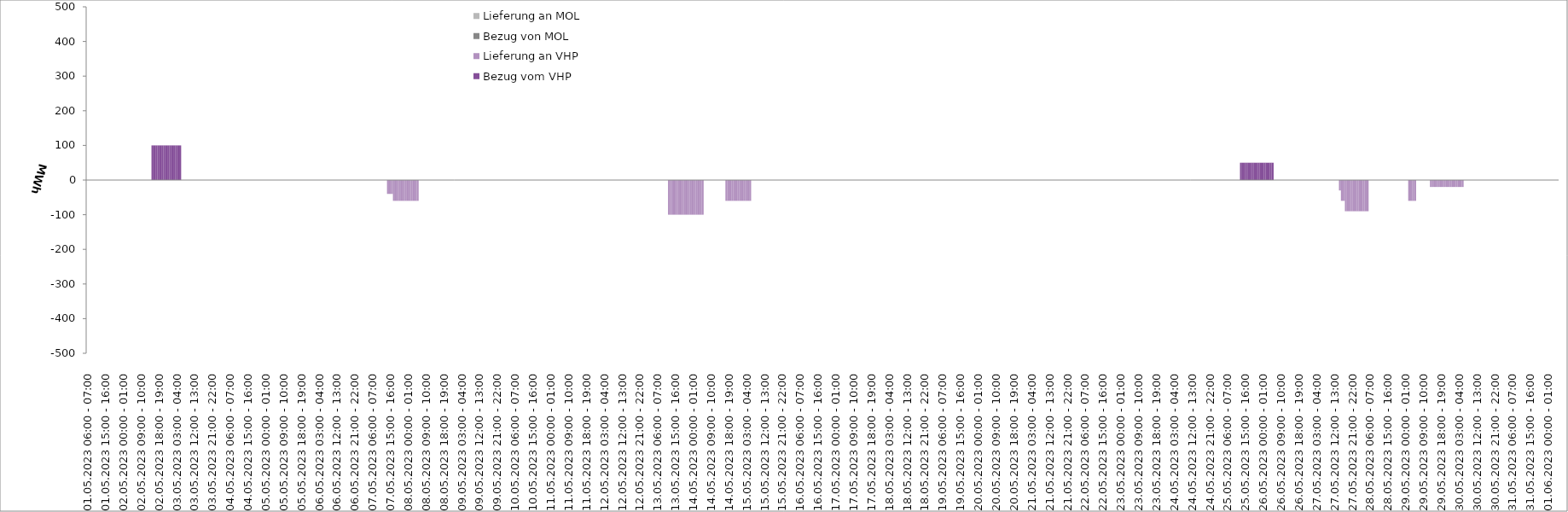
| Category | Bezug vom VHP | Lieferung an VHP | Bezug von MOL | Lieferung an MOL |
|---|---|---|---|---|
| 01.05.2023 06:00 - 07:00 | 0 | 0 | 0 | 0 |
| 01.05.2023 07:00 - 08:00 | 0 | 0 | 0 | 0 |
| 01.05.2023 08:00 - 09:00 | 0 | 0 | 0 | 0 |
| 01.05.2023 09:00 - 10:00 | 0 | 0 | 0 | 0 |
| 01.05.2023 10:00 - 11:00 | 0 | 0 | 0 | 0 |
| 01.05.2023 11:00 - 12:00 | 0 | 0 | 0 | 0 |
| 01.05.2023 12:00 - 13:00 | 0 | 0 | 0 | 0 |
| 01.05.2023 13:00 - 14:00 | 0 | 0 | 0 | 0 |
| 01.05.2023 14:00 - 15:00 | 0 | 0 | 0 | 0 |
| 01.05.2023 15:00 - 16:00 | 0 | 0 | 0 | 0 |
| 01.05.2023 16:00 - 17:00 | 0 | 0 | 0 | 0 |
| 01.05.2023 17:00 - 18:00 | 0 | 0 | 0 | 0 |
| 01.05.2023 18:00 - 19:00 | 0 | 0 | 0 | 0 |
| 01.05.2023 19:00 - 20:00 | 0 | 0 | 0 | 0 |
| 01.05.2023 20:00 - 21:00 | 0 | 0 | 0 | 0 |
| 01.05.2023 21:00 - 22:00 | 0 | 0 | 0 | 0 |
| 01.05.2023 22:00 - 23:00 | 0 | 0 | 0 | 0 |
| 01.05.2023 23:00 - 24:00 | 0 | 0 | 0 | 0 |
| 02.05.2023 00:00 - 01:00 | 0 | 0 | 0 | 0 |
| 02.05.2023 01:00 - 02:00 | 0 | 0 | 0 | 0 |
| 02.05.2023 02:00 - 03:00 | 0 | 0 | 0 | 0 |
| 02.05.2023 03:00 - 04:00 | 0 | 0 | 0 | 0 |
| 02.05.2023 04:00 - 05:00 | 0 | 0 | 0 | 0 |
| 02.05.2023 05:00 - 06:00 | 0 | 0 | 0 | 0 |
| 02.05.2023 06:00 - 07:00 | 0 | 0 | 0 | 0 |
| 02.05.2023 07:00 - 08:00 | 0 | 0 | 0 | 0 |
| 02.05.2023 08:00 - 09:00 | 0 | 0 | 0 | 0 |
| 02.05.2023 09:00 - 10:00 | 0 | 0 | 0 | 0 |
| 02.05.2023 10:00 - 11:00 | 0 | 0 | 0 | 0 |
| 02.05.2023 11:00 - 12:00 | 0 | 0 | 0 | 0 |
| 02.05.2023 12:00 - 13:00 | 0 | 0 | 0 | 0 |
| 02.05.2023 13:00 - 14:00 | 0 | 0 | 0 | 0 |
| 02.05.2023 14:00 - 15:00 | 0 | 0 | 0 | 0 |
| 02.05.2023 15:00 - 16:00 | 100 | 0 | 0 | 0 |
| 02.05.2023 16:00 - 17:00 | 100 | 0 | 0 | 0 |
| 02.05.2023 17:00 - 18:00 | 100 | 0 | 0 | 0 |
| 02.05.2023 18:00 - 19:00 | 100 | 0 | 0 | 0 |
| 02.05.2023 19:00 - 20:00 | 100 | 0 | 0 | 0 |
| 02.05.2023 20:00 - 21:00 | 100 | 0 | 0 | 0 |
| 02.05.2023 21:00 - 22:00 | 100 | 0 | 0 | 0 |
| 02.05.2023 22:00 - 23:00 | 100 | 0 | 0 | 0 |
| 02.05.2023 23:00 - 24:00 | 100 | 0 | 0 | 0 |
| 03.05.2023 00:00 - 01:00 | 100 | 0 | 0 | 0 |
| 03.05.2023 01:00 - 02:00 | 100 | 0 | 0 | 0 |
| 03.05.2023 02:00 - 03:00 | 100 | 0 | 0 | 0 |
| 03.05.2023 03:00 - 04:00 | 100 | 0 | 0 | 0 |
| 03.05.2023 04:00 - 05:00 | 100 | 0 | 0 | 0 |
| 03.05.2023 05:00 - 06:00 | 100 | 0 | 0 | 0 |
| 03.05.2023 06:00 - 07:00 | 0 | 0 | 0 | 0 |
| 03.05.2023 07:00 - 08:00 | 0 | 0 | 0 | 0 |
| 03.05.2023 08:00 - 09:00 | 0 | 0 | 0 | 0 |
| 03.05.2023 09:00 - 10:00 | 0 | 0 | 0 | 0 |
| 03.05.2023 10:00 - 11:00 | 0 | 0 | 0 | 0 |
| 03.05.2023 11:00 - 12:00 | 0 | 0 | 0 | 0 |
| 03.05.2023 12:00 - 13:00 | 0 | 0 | 0 | 0 |
| 03.05.2023 13:00 - 14:00 | 0 | 0 | 0 | 0 |
| 03.05.2023 14:00 - 15:00 | 0 | 0 | 0 | 0 |
| 03.05.2023 15:00 - 16:00 | 0 | 0 | 0 | 0 |
| 03.05.2023 16:00 - 17:00 | 0 | 0 | 0 | 0 |
| 03.05.2023 17:00 - 18:00 | 0 | 0 | 0 | 0 |
| 03.05.2023 18:00 - 19:00 | 0 | 0 | 0 | 0 |
| 03.05.2023 19:00 - 20:00 | 0 | 0 | 0 | 0 |
| 03.05.2023 20:00 - 21:00 | 0 | 0 | 0 | 0 |
| 03.05.2023 21:00 - 22:00 | 0 | 0 | 0 | 0 |
| 03.05.2023 22:00 - 23:00 | 0 | 0 | 0 | 0 |
| 03.05.2023 23:00 - 24:00 | 0 | 0 | 0 | 0 |
| 04.05.2023 00:00 - 01:00 | 0 | 0 | 0 | 0 |
| 04.05.2023 01:00 - 02:00 | 0 | 0 | 0 | 0 |
| 04.05.2023 02:00 - 03:00 | 0 | 0 | 0 | 0 |
| 04.05.2023 03:00 - 04:00 | 0 | 0 | 0 | 0 |
| 04.05.2023 04:00 - 05:00 | 0 | 0 | 0 | 0 |
| 04.05.2023 05:00 - 06:00 | 0 | 0 | 0 | 0 |
| 04.05.2023 06:00 - 07:00 | 0 | 0 | 0 | 0 |
| 04.05.2023 07:00 - 08:00 | 0 | 0 | 0 | 0 |
| 04.05.2023 08:00 - 09:00 | 0 | 0 | 0 | 0 |
| 04.05.2023 09:00 - 10:00 | 0 | 0 | 0 | 0 |
| 04.05.2023 10:00 - 11:00 | 0 | 0 | 0 | 0 |
| 04.05.2023 11:00 - 12:00 | 0 | 0 | 0 | 0 |
| 04.05.2023 12:00 - 13:00 | 0 | 0 | 0 | 0 |
| 04.05.2023 13:00 - 14:00 | 0 | 0 | 0 | 0 |
| 04.05.2023 14:00 - 15:00 | 0 | 0 | 0 | 0 |
| 04.05.2023 15:00 - 16:00 | 0 | 0 | 0 | 0 |
| 04.05.2023 16:00 - 17:00 | 0 | 0 | 0 | 0 |
| 04.05.2023 17:00 - 18:00 | 0 | 0 | 0 | 0 |
| 04.05.2023 18:00 - 19:00 | 0 | 0 | 0 | 0 |
| 04.05.2023 19:00 - 20:00 | 0 | 0 | 0 | 0 |
| 04.05.2023 20:00 - 21:00 | 0 | 0 | 0 | 0 |
| 04.05.2023 21:00 - 22:00 | 0 | 0 | 0 | 0 |
| 04.05.2023 22:00 - 23:00 | 0 | 0 | 0 | 0 |
| 04.05.2023 23:00 - 24:00 | 0 | 0 | 0 | 0 |
| 05.05.2023 00:00 - 01:00 | 0 | 0 | 0 | 0 |
| 05.05.2023 01:00 - 02:00 | 0 | 0 | 0 | 0 |
| 05.05.2023 02:00 - 03:00 | 0 | 0 | 0 | 0 |
| 05.05.2023 03:00 - 04:00 | 0 | 0 | 0 | 0 |
| 05.05.2023 04:00 - 05:00 | 0 | 0 | 0 | 0 |
| 05.05.2023 05:00 - 06:00 | 0 | 0 | 0 | 0 |
| 05.05.2023 06:00 - 07:00 | 0 | 0 | 0 | 0 |
| 05.05.2023 07:00 - 08:00 | 0 | 0 | 0 | 0 |
| 05.05.2023 08:00 - 09:00 | 0 | 0 | 0 | 0 |
| 05.05.2023 09:00 - 10:00 | 0 | 0 | 0 | 0 |
| 05.05.2023 10:00 - 11:00 | 0 | 0 | 0 | 0 |
| 05.05.2023 11:00 - 12:00 | 0 | 0 | 0 | 0 |
| 05.05.2023 12:00 - 13:00 | 0 | 0 | 0 | 0 |
| 05.05.2023 13:00 - 14:00 | 0 | 0 | 0 | 0 |
| 05.05.2023 14:00 - 15:00 | 0 | 0 | 0 | 0 |
| 05.05.2023 15:00 - 16:00 | 0 | 0 | 0 | 0 |
| 05.05.2023 16:00 - 17:00 | 0 | 0 | 0 | 0 |
| 05.05.2023 17:00 - 18:00 | 0 | 0 | 0 | 0 |
| 05.05.2023 18:00 - 19:00 | 0 | 0 | 0 | 0 |
| 05.05.2023 19:00 - 20:00 | 0 | 0 | 0 | 0 |
| 05.05.2023 20:00 - 21:00 | 0 | 0 | 0 | 0 |
| 05.05.2023 21:00 - 22:00 | 0 | 0 | 0 | 0 |
| 05.05.2023 22:00 - 23:00 | 0 | 0 | 0 | 0 |
| 05.05.2023 23:00 - 24:00 | 0 | 0 | 0 | 0 |
| 06.05.2023 00:00 - 01:00 | 0 | 0 | 0 | 0 |
| 06.05.2023 01:00 - 02:00 | 0 | 0 | 0 | 0 |
| 06.05.2023 02:00 - 03:00 | 0 | 0 | 0 | 0 |
| 06.05.2023 03:00 - 04:00 | 0 | 0 | 0 | 0 |
| 06.05.2023 04:00 - 05:00 | 0 | 0 | 0 | 0 |
| 06.05.2023 05:00 - 06:00 | 0 | 0 | 0 | 0 |
| 06.05.2023 06:00 - 07:00 | 0 | 0 | 0 | 0 |
| 06.05.2023 07:00 - 08:00 | 0 | 0 | 0 | 0 |
| 06.05.2023 08:00 - 09:00 | 0 | 0 | 0 | 0 |
| 06.05.2023 09:00 - 10:00 | 0 | 0 | 0 | 0 |
| 06.05.2023 10:00 - 11:00 | 0 | 0 | 0 | 0 |
| 06.05.2023 11:00 - 12:00 | 0 | 0 | 0 | 0 |
| 06.05.2023 12:00 - 13:00 | 0 | 0 | 0 | 0 |
| 06.05.2023 13:00 - 14:00 | 0 | 0 | 0 | 0 |
| 06.05.2023 14:00 - 15:00 | 0 | 0 | 0 | 0 |
| 06.05.2023 15:00 - 16:00 | 0 | 0 | 0 | 0 |
| 06.05.2023 16:00 - 17:00 | 0 | 0 | 0 | 0 |
| 06.05.2023 17:00 - 18:00 | 0 | 0 | 0 | 0 |
| 06.05.2023 18:00 - 19:00 | 0 | 0 | 0 | 0 |
| 06.05.2023 19:00 - 20:00 | 0 | 0 | 0 | 0 |
| 06.05.2023 20:00 - 21:00 | 0 | 0 | 0 | 0 |
| 06.05.2023 21:00 - 22:00 | 0 | 0 | 0 | 0 |
| 06.05.2023 22:00 - 23:00 | 0 | 0 | 0 | 0 |
| 06.05.2023 23:00 - 24:00 | 0 | 0 | 0 | 0 |
| 07.05.2023 00:00 - 01:00 | 0 | 0 | 0 | 0 |
| 07.05.2023 01:00 - 02:00 | 0 | 0 | 0 | 0 |
| 07.05.2023 02:00 - 03:00 | 0 | 0 | 0 | 0 |
| 07.05.2023 03:00 - 04:00 | 0 | 0 | 0 | 0 |
| 07.05.2023 04:00 - 05:00 | 0 | 0 | 0 | 0 |
| 07.05.2023 05:00 - 06:00 | 0 | 0 | 0 | 0 |
| 07.05.2023 06:00 - 07:00 | 0 | 0 | 0 | 0 |
| 07.05.2023 07:00 - 08:00 | 0 | 0 | 0 | 0 |
| 07.05.2023 08:00 - 09:00 | 0 | 0 | 0 | 0 |
| 07.05.2023 09:00 - 10:00 | 0 | 0 | 0 | 0 |
| 07.05.2023 10:00 - 11:00 | 0 | 0 | 0 | 0 |
| 07.05.2023 11:00 - 12:00 | 0 | 0 | 0 | 0 |
| 07.05.2023 12:00 - 13:00 | 0 | 0 | 0 | 0 |
| 07.05.2023 13:00 - 14:00 | 0 | 0 | 0 | 0 |
| 07.05.2023 14:00 - 15:00 | 0 | -40 | 0 | 0 |
| 07.05.2023 15:00 - 16:00 | 0 | -40 | 0 | 0 |
| 07.05.2023 16:00 - 17:00 | 0 | -40 | 0 | 0 |
| 07.05.2023 17:00 - 18:00 | 0 | -60 | 0 | 0 |
| 07.05.2023 18:00 - 19:00 | 0 | -60 | 0 | 0 |
| 07.05.2023 19:00 - 20:00 | 0 | -60 | 0 | 0 |
| 07.05.2023 20:00 - 21:00 | 0 | -60 | 0 | 0 |
| 07.05.2023 21:00 - 22:00 | 0 | -60 | 0 | 0 |
| 07.05.2023 22:00 - 23:00 | 0 | -60 | 0 | 0 |
| 07.05.2023 23:00 - 24:00 | 0 | -60 | 0 | 0 |
| 08.05.2023 00:00 - 01:00 | 0 | -60 | 0 | 0 |
| 08.05.2023 01:00 - 02:00 | 0 | -60 | 0 | 0 |
| 08.05.2023 02:00 - 03:00 | 0 | -60 | 0 | 0 |
| 08.05.2023 03:00 - 04:00 | 0 | -60 | 0 | 0 |
| 08.05.2023 04:00 - 05:00 | 0 | -60 | 0 | 0 |
| 08.05.2023 05:00 - 06:00 | 0 | -60 | 0 | 0 |
| 08.05.2023 06:00 - 07:00 | 0 | 0 | 0 | 0 |
| 08.05.2023 07:00 - 08:00 | 0 | 0 | 0 | 0 |
| 08.05.2023 08:00 - 09:00 | 0 | 0 | 0 | 0 |
| 08.05.2023 09:00 - 10:00 | 0 | 0 | 0 | 0 |
| 08.05.2023 10:00 - 11:00 | 0 | 0 | 0 | 0 |
| 08.05.2023 11:00 - 12:00 | 0 | 0 | 0 | 0 |
| 08.05.2023 12:00 - 13:00 | 0 | 0 | 0 | 0 |
| 08.05.2023 13:00 - 14:00 | 0 | 0 | 0 | 0 |
| 08.05.2023 14:00 - 15:00 | 0 | 0 | 0 | 0 |
| 08.05.2023 15:00 - 16:00 | 0 | 0 | 0 | 0 |
| 08.05.2023 16:00 - 17:00 | 0 | 0 | 0 | 0 |
| 08.05.2023 17:00 - 18:00 | 0 | 0 | 0 | 0 |
| 08.05.2023 18:00 - 19:00 | 0 | 0 | 0 | 0 |
| 08.05.2023 19:00 - 20:00 | 0 | 0 | 0 | 0 |
| 08.05.2023 20:00 - 21:00 | 0 | 0 | 0 | 0 |
| 08.05.2023 21:00 - 22:00 | 0 | 0 | 0 | 0 |
| 08.05.2023 22:00 - 23:00 | 0 | 0 | 0 | 0 |
| 08.05.2023 23:00 - 24:00 | 0 | 0 | 0 | 0 |
| 09.05.2023 00:00 - 01:00 | 0 | 0 | 0 | 0 |
| 09.05.2023 01:00 - 02:00 | 0 | 0 | 0 | 0 |
| 09.05.2023 02:00 - 03:00 | 0 | 0 | 0 | 0 |
| 09.05.2023 03:00 - 04:00 | 0 | 0 | 0 | 0 |
| 09.05.2023 04:00 - 05:00 | 0 | 0 | 0 | 0 |
| 09.05.2023 05:00 - 06:00 | 0 | 0 | 0 | 0 |
| 09.05.2023 06:00 - 07:00 | 0 | 0 | 0 | 0 |
| 09.05.2023 07:00 - 08:00 | 0 | 0 | 0 | 0 |
| 09.05.2023 08:00 - 09:00 | 0 | 0 | 0 | 0 |
| 09.05.2023 09:00 - 10:00 | 0 | 0 | 0 | 0 |
| 09.05.2023 10:00 - 11:00 | 0 | 0 | 0 | 0 |
| 09.05.2023 11:00 - 12:00 | 0 | 0 | 0 | 0 |
| 09.05.2023 12:00 - 13:00 | 0 | 0 | 0 | 0 |
| 09.05.2023 13:00 - 14:00 | 0 | 0 | 0 | 0 |
| 09.05.2023 14:00 - 15:00 | 0 | 0 | 0 | 0 |
| 09.05.2023 15:00 - 16:00 | 0 | 0 | 0 | 0 |
| 09.05.2023 16:00 - 17:00 | 0 | 0 | 0 | 0 |
| 09.05.2023 17:00 - 18:00 | 0 | 0 | 0 | 0 |
| 09.05.2023 18:00 - 19:00 | 0 | 0 | 0 | 0 |
| 09.05.2023 19:00 - 20:00 | 0 | 0 | 0 | 0 |
| 09.05.2023 20:00 - 21:00 | 0 | 0 | 0 | 0 |
| 09.05.2023 21:00 - 22:00 | 0 | 0 | 0 | 0 |
| 09.05.2023 22:00 - 23:00 | 0 | 0 | 0 | 0 |
| 09.05.2023 23:00 - 24:00 | 0 | 0 | 0 | 0 |
| 10.05.2023 00:00 - 01:00 | 0 | 0 | 0 | 0 |
| 10.05.2023 01:00 - 02:00 | 0 | 0 | 0 | 0 |
| 10.05.2023 02:00 - 03:00 | 0 | 0 | 0 | 0 |
| 10.05.2023 03:00 - 04:00 | 0 | 0 | 0 | 0 |
| 10.05.2023 04:00 - 05:00 | 0 | 0 | 0 | 0 |
| 10.05.2023 05:00 - 06:00 | 0 | 0 | 0 | 0 |
| 10.05.2023 06:00 - 07:00 | 0 | 0 | 0 | 0 |
| 10.05.2023 07:00 - 08:00 | 0 | 0 | 0 | 0 |
| 10.05.2023 08:00 - 09:00 | 0 | 0 | 0 | 0 |
| 10.05.2023 09:00 - 10:00 | 0 | 0 | 0 | 0 |
| 10.05.2023 10:00 - 11:00 | 0 | 0 | 0 | 0 |
| 10.05.2023 11:00 - 12:00 | 0 | 0 | 0 | 0 |
| 10.05.2023 12:00 - 13:00 | 0 | 0 | 0 | 0 |
| 10.05.2023 13:00 - 14:00 | 0 | 0 | 0 | 0 |
| 10.05.2023 14:00 - 15:00 | 0 | 0 | 0 | 0 |
| 10.05.2023 15:00 - 16:00 | 0 | 0 | 0 | 0 |
| 10.05.2023 16:00 - 17:00 | 0 | 0 | 0 | 0 |
| 10.05.2023 17:00 - 18:00 | 0 | 0 | 0 | 0 |
| 10.05.2023 18:00 - 19:00 | 0 | 0 | 0 | 0 |
| 10.05.2023 19:00 - 20:00 | 0 | 0 | 0 | 0 |
| 10.05.2023 20:00 - 21:00 | 0 | 0 | 0 | 0 |
| 10.05.2023 21:00 - 22:00 | 0 | 0 | 0 | 0 |
| 10.05.2023 22:00 - 23:00 | 0 | 0 | 0 | 0 |
| 10.05.2023 23:00 - 24:00 | 0 | 0 | 0 | 0 |
| 11.05.2023 00:00 - 01:00 | 0 | 0 | 0 | 0 |
| 11.05.2023 01:00 - 02:00 | 0 | 0 | 0 | 0 |
| 11.05.2023 02:00 - 03:00 | 0 | 0 | 0 | 0 |
| 11.05.2023 03:00 - 04:00 | 0 | 0 | 0 | 0 |
| 11.05.2023 04:00 - 05:00 | 0 | 0 | 0 | 0 |
| 11.05.2023 05:00 - 06:00 | 0 | 0 | 0 | 0 |
| 11.05.2023 06:00 - 07:00 | 0 | 0 | 0 | 0 |
| 11.05.2023 07:00 - 08:00 | 0 | 0 | 0 | 0 |
| 11.05.2023 08:00 - 09:00 | 0 | 0 | 0 | 0 |
| 11.05.2023 09:00 - 10:00 | 0 | 0 | 0 | 0 |
| 11.05.2023 10:00 - 11:00 | 0 | 0 | 0 | 0 |
| 11.05.2023 11:00 - 12:00 | 0 | 0 | 0 | 0 |
| 11.05.2023 12:00 - 13:00 | 0 | 0 | 0 | 0 |
| 11.05.2023 13:00 - 14:00 | 0 | 0 | 0 | 0 |
| 11.05.2023 14:00 - 15:00 | 0 | 0 | 0 | 0 |
| 11.05.2023 15:00 - 16:00 | 0 | 0 | 0 | 0 |
| 11.05.2023 16:00 - 17:00 | 0 | 0 | 0 | 0 |
| 11.05.2023 17:00 - 18:00 | 0 | 0 | 0 | 0 |
| 11.05.2023 18:00 - 19:00 | 0 | 0 | 0 | 0 |
| 11.05.2023 19:00 - 20:00 | 0 | 0 | 0 | 0 |
| 11.05.2023 20:00 - 21:00 | 0 | 0 | 0 | 0 |
| 11.05.2023 21:00 - 22:00 | 0 | 0 | 0 | 0 |
| 11.05.2023 22:00 - 23:00 | 0 | 0 | 0 | 0 |
| 11.05.2023 23:00 - 24:00 | 0 | 0 | 0 | 0 |
| 12.05.2023 00:00 - 01:00 | 0 | 0 | 0 | 0 |
| 12.05.2023 01:00 - 02:00 | 0 | 0 | 0 | 0 |
| 12.05.2023 02:00 - 03:00 | 0 | 0 | 0 | 0 |
| 12.05.2023 03:00 - 04:00 | 0 | 0 | 0 | 0 |
| 12.05.2023 04:00 - 05:00 | 0 | 0 | 0 | 0 |
| 12.05.2023 05:00 - 06:00 | 0 | 0 | 0 | 0 |
| 12.05.2023 06:00 - 07:00 | 0 | 0 | 0 | 0 |
| 12.05.2023 07:00 - 08:00 | 0 | 0 | 0 | 0 |
| 12.05.2023 08:00 - 09:00 | 0 | 0 | 0 | 0 |
| 12.05.2023 09:00 - 10:00 | 0 | 0 | 0 | 0 |
| 12.05.2023 10:00 - 11:00 | 0 | 0 | 0 | 0 |
| 12.05.2023 11:00 - 12:00 | 0 | 0 | 0 | 0 |
| 12.05.2023 12:00 - 13:00 | 0 | 0 | 0 | 0 |
| 12.05.2023 13:00 - 14:00 | 0 | 0 | 0 | 0 |
| 12.05.2023 14:00 - 15:00 | 0 | 0 | 0 | 0 |
| 12.05.2023 15:00 - 16:00 | 0 | 0 | 0 | 0 |
| 12.05.2023 16:00 - 17:00 | 0 | 0 | 0 | 0 |
| 12.05.2023 17:00 - 18:00 | 0 | 0 | 0 | 0 |
| 12.05.2023 18:00 - 19:00 | 0 | 0 | 0 | 0 |
| 12.05.2023 19:00 - 20:00 | 0 | 0 | 0 | 0 |
| 12.05.2023 20:00 - 21:00 | 0 | 0 | 0 | 0 |
| 12.05.2023 21:00 - 22:00 | 0 | 0 | 0 | 0 |
| 12.05.2023 22:00 - 23:00 | 0 | 0 | 0 | 0 |
| 12.05.2023 23:00 - 24:00 | 0 | 0 | 0 | 0 |
| 13.05.2023 00:00 - 01:00 | 0 | 0 | 0 | 0 |
| 13.05.2023 01:00 - 02:00 | 0 | 0 | 0 | 0 |
| 13.05.2023 02:00 - 03:00 | 0 | 0 | 0 | 0 |
| 13.05.2023 03:00 - 04:00 | 0 | 0 | 0 | 0 |
| 13.05.2023 04:00 - 05:00 | 0 | 0 | 0 | 0 |
| 13.05.2023 05:00 - 06:00 | 0 | 0 | 0 | 0 |
| 13.05.2023 06:00 - 07:00 | 0 | 0 | 0 | 0 |
| 13.05.2023 07:00 - 08:00 | 0 | 0 | 0 | 0 |
| 13.05.2023 08:00 - 09:00 | 0 | 0 | 0 | 0 |
| 13.05.2023 09:00 - 10:00 | 0 | 0 | 0 | 0 |
| 13.05.2023 10:00 - 11:00 | 0 | 0 | 0 | 0 |
| 13.05.2023 11:00 - 12:00 | 0 | 0 | 0 | 0 |
| 13.05.2023 12:00 - 13:00 | 0 | -100 | 0 | 0 |
| 13.05.2023 13:00 - 14:00 | 0 | -100 | 0 | 0 |
| 13.05.2023 14:00 - 15:00 | 0 | -100 | 0 | 0 |
| 13.05.2023 15:00 - 16:00 | 0 | -100 | 0 | 0 |
| 13.05.2023 16:00 - 17:00 | 0 | -100 | 0 | 0 |
| 13.05.2023 17:00 - 18:00 | 0 | -100 | 0 | 0 |
| 13.05.2023 18:00 - 19:00 | 0 | -100 | 0 | 0 |
| 13.05.2023 19:00 - 20:00 | 0 | -100 | 0 | 0 |
| 13.05.2023 20:00 - 21:00 | 0 | -100 | 0 | 0 |
| 13.05.2023 21:00 - 22:00 | 0 | -100 | 0 | 0 |
| 13.05.2023 22:00 - 23:00 | 0 | -100 | 0 | 0 |
| 13.05.2023 23:00 - 24:00 | 0 | -100 | 0 | 0 |
| 14.05.2023 00:00 - 01:00 | 0 | -100 | 0 | 0 |
| 14.05.2023 01:00 - 02:00 | 0 | -100 | 0 | 0 |
| 14.05.2023 02:00 - 03:00 | 0 | -100 | 0 | 0 |
| 14.05.2023 03:00 - 04:00 | 0 | -100 | 0 | 0 |
| 14.05.2023 04:00 - 05:00 | 0 | -100 | 0 | 0 |
| 14.05.2023 05:00 - 06:00 | 0 | -100 | 0 | 0 |
| 14.05.2023 06:00 - 07:00 | 0 | 0 | 0 | 0 |
| 14.05.2023 07:00 - 08:00 | 0 | 0 | 0 | 0 |
| 14.05.2023 08:00 - 09:00 | 0 | 0 | 0 | 0 |
| 14.05.2023 09:00 - 10:00 | 0 | 0 | 0 | 0 |
| 14.05.2023 10:00 - 11:00 | 0 | 0 | 0 | 0 |
| 14.05.2023 11:00 - 12:00 | 0 | 0 | 0 | 0 |
| 14.05.2023 12:00 - 13:00 | 0 | 0 | 0 | 0 |
| 14.05.2023 13:00 - 14:00 | 0 | 0 | 0 | 0 |
| 14.05.2023 14:00 - 15:00 | 0 | 0 | 0 | 0 |
| 14.05.2023 15:00 - 16:00 | 0 | 0 | 0 | 0 |
| 14.05.2023 16:00 - 17:00 | 0 | 0 | 0 | 0 |
| 14.05.2023 17:00 - 18:00 | 0 | -60 | 0 | 0 |
| 14.05.2023 18:00 - 19:00 | 0 | -60 | 0 | 0 |
| 14.05.2023 19:00 - 20:00 | 0 | -60 | 0 | 0 |
| 14.05.2023 20:00 - 21:00 | 0 | -60 | 0 | 0 |
| 14.05.2023 21:00 - 22:00 | 0 | -60 | 0 | 0 |
| 14.05.2023 22:00 - 23:00 | 0 | -60 | 0 | 0 |
| 14.05.2023 23:00 - 24:00 | 0 | -60 | 0 | 0 |
| 15.05.2023 00:00 - 01:00 | 0 | -60 | 0 | 0 |
| 15.05.2023 01:00 - 02:00 | 0 | -60 | 0 | 0 |
| 15.05.2023 02:00 - 03:00 | 0 | -60 | 0 | 0 |
| 15.05.2023 03:00 - 04:00 | 0 | -60 | 0 | 0 |
| 15.05.2023 04:00 - 05:00 | 0 | -60 | 0 | 0 |
| 15.05.2023 05:00 - 06:00 | 0 | -60 | 0 | 0 |
| 15.05.2023 06:00 - 07:00 | 0 | 0 | 0 | 0 |
| 15.05.2023 07:00 - 08:00 | 0 | 0 | 0 | 0 |
| 15.05.2023 08:00 - 09:00 | 0 | 0 | 0 | 0 |
| 15.05.2023 09:00 - 10:00 | 0 | 0 | 0 | 0 |
| 15.05.2023 10:00 - 11:00 | 0 | 0 | 0 | 0 |
| 15.05.2023 11:00 - 12:00 | 0 | 0 | 0 | 0 |
| 15.05.2023 12:00 - 13:00 | 0 | 0 | 0 | 0 |
| 15.05.2023 13:00 - 14:00 | 0 | 0 | 0 | 0 |
| 15.05.2023 14:00 - 15:00 | 0 | 0 | 0 | 0 |
| 15.05.2023 15:00 - 16:00 | 0 | 0 | 0 | 0 |
| 15.05.2023 16:00 - 17:00 | 0 | 0 | 0 | 0 |
| 15.05.2023 17:00 - 18:00 | 0 | 0 | 0 | 0 |
| 15.05.2023 18:00 - 19:00 | 0 | 0 | 0 | 0 |
| 15.05.2023 19:00 - 20:00 | 0 | 0 | 0 | 0 |
| 15.05.2023 20:00 - 21:00 | 0 | 0 | 0 | 0 |
| 15.05.2023 21:00 - 22:00 | 0 | 0 | 0 | 0 |
| 15.05.2023 22:00 - 23:00 | 0 | 0 | 0 | 0 |
| 15.05.2023 23:00 - 24:00 | 0 | 0 | 0 | 0 |
| 16.05.2023 00:00 - 01:00 | 0 | 0 | 0 | 0 |
| 16.05.2023 01:00 - 02:00 | 0 | 0 | 0 | 0 |
| 16.05.2023 02:00 - 03:00 | 0 | 0 | 0 | 0 |
| 16.05.2023 03:00 - 04:00 | 0 | 0 | 0 | 0 |
| 16.05.2023 04:00 - 05:00 | 0 | 0 | 0 | 0 |
| 16.05.2023 05:00 - 06:00 | 0 | 0 | 0 | 0 |
| 16.05.2023 06:00 - 07:00 | 0 | 0 | 0 | 0 |
| 16.05.2023 07:00 - 08:00 | 0 | 0 | 0 | 0 |
| 16.05.2023 08:00 - 09:00 | 0 | 0 | 0 | 0 |
| 16.05.2023 09:00 - 10:00 | 0 | 0 | 0 | 0 |
| 16.05.2023 10:00 - 11:00 | 0 | 0 | 0 | 0 |
| 16.05.2023 11:00 - 12:00 | 0 | 0 | 0 | 0 |
| 16.05.2023 12:00 - 13:00 | 0 | 0 | 0 | 0 |
| 16.05.2023 13:00 - 14:00 | 0 | 0 | 0 | 0 |
| 16.05.2023 14:00 - 15:00 | 0 | 0 | 0 | 0 |
| 16.05.2023 15:00 - 16:00 | 0 | 0 | 0 | 0 |
| 16.05.2023 16:00 - 17:00 | 0 | 0 | 0 | 0 |
| 16.05.2023 17:00 - 18:00 | 0 | 0 | 0 | 0 |
| 16.05.2023 18:00 - 19:00 | 0 | 0 | 0 | 0 |
| 16.05.2023 19:00 - 20:00 | 0 | 0 | 0 | 0 |
| 16.05.2023 20:00 - 21:00 | 0 | 0 | 0 | 0 |
| 16.05.2023 21:00 - 22:00 | 0 | 0 | 0 | 0 |
| 16.05.2023 22:00 - 23:00 | 0 | 0 | 0 | 0 |
| 16.05.2023 23:00 - 24:00 | 0 | 0 | 0 | 0 |
| 17.05.2023 00:00 - 01:00 | 0 | 0 | 0 | 0 |
| 17.05.2023 01:00 - 02:00 | 0 | 0 | 0 | 0 |
| 17.05.2023 02:00 - 03:00 | 0 | 0 | 0 | 0 |
| 17.05.2023 03:00 - 04:00 | 0 | 0 | 0 | 0 |
| 17.05.2023 04:00 - 05:00 | 0 | 0 | 0 | 0 |
| 17.05.2023 05:00 - 06:00 | 0 | 0 | 0 | 0 |
| 17.05.2023 06:00 - 07:00 | 0 | 0 | 0 | 0 |
| 17.05.2023 07:00 - 08:00 | 0 | 0 | 0 | 0 |
| 17.05.2023 08:00 - 09:00 | 0 | 0 | 0 | 0 |
| 17.05.2023 09:00 - 10:00 | 0 | 0 | 0 | 0 |
| 17.05.2023 10:00 - 11:00 | 0 | 0 | 0 | 0 |
| 17.05.2023 11:00 - 12:00 | 0 | 0 | 0 | 0 |
| 17.05.2023 12:00 - 13:00 | 0 | 0 | 0 | 0 |
| 17.05.2023 13:00 - 14:00 | 0 | 0 | 0 | 0 |
| 17.05.2023 14:00 - 15:00 | 0 | 0 | 0 | 0 |
| 17.05.2023 15:00 - 16:00 | 0 | 0 | 0 | 0 |
| 17.05.2023 16:00 - 17:00 | 0 | 0 | 0 | 0 |
| 17.05.2023 17:00 - 18:00 | 0 | 0 | 0 | 0 |
| 17.05.2023 18:00 - 19:00 | 0 | 0 | 0 | 0 |
| 17.05.2023 19:00 - 20:00 | 0 | 0 | 0 | 0 |
| 17.05.2023 20:00 - 21:00 | 0 | 0 | 0 | 0 |
| 17.05.2023 21:00 - 22:00 | 0 | 0 | 0 | 0 |
| 17.05.2023 22:00 - 23:00 | 0 | 0 | 0 | 0 |
| 17.05.2023 23:00 - 24:00 | 0 | 0 | 0 | 0 |
| 18.05.2023 00:00 - 01:00 | 0 | 0 | 0 | 0 |
| 18.05.2023 01:00 - 02:00 | 0 | 0 | 0 | 0 |
| 18.05.2023 02:00 - 03:00 | 0 | 0 | 0 | 0 |
| 18.05.2023 03:00 - 04:00 | 0 | 0 | 0 | 0 |
| 18.05.2023 04:00 - 05:00 | 0 | 0 | 0 | 0 |
| 18.05.2023 05:00 - 06:00 | 0 | 0 | 0 | 0 |
| 18.05.2023 06:00 - 07:00 | 0 | 0 | 0 | 0 |
| 18.05.2023 07:00 - 08:00 | 0 | 0 | 0 | 0 |
| 18.05.2023 08:00 - 09:00 | 0 | 0 | 0 | 0 |
| 18.05.2023 09:00 - 10:00 | 0 | 0 | 0 | 0 |
| 18.05.2023 10:00 - 11:00 | 0 | 0 | 0 | 0 |
| 18.05.2023 11:00 - 12:00 | 0 | 0 | 0 | 0 |
| 18.05.2023 12:00 - 13:00 | 0 | 0 | 0 | 0 |
| 18.05.2023 13:00 - 14:00 | 0 | 0 | 0 | 0 |
| 18.05.2023 14:00 - 15:00 | 0 | 0 | 0 | 0 |
| 18.05.2023 15:00 - 16:00 | 0 | 0 | 0 | 0 |
| 18.05.2023 16:00 - 17:00 | 0 | 0 | 0 | 0 |
| 18.05.2023 17:00 - 18:00 | 0 | 0 | 0 | 0 |
| 18.05.2023 18:00 - 19:00 | 0 | 0 | 0 | 0 |
| 18.05.2023 19:00 - 20:00 | 0 | 0 | 0 | 0 |
| 18.05.2023 20:00 - 21:00 | 0 | 0 | 0 | 0 |
| 18.05.2023 21:00 - 22:00 | 0 | 0 | 0 | 0 |
| 18.05.2023 22:00 - 23:00 | 0 | 0 | 0 | 0 |
| 18.05.2023 23:00 - 24:00 | 0 | 0 | 0 | 0 |
| 19.05.2023 00:00 - 01:00 | 0 | 0 | 0 | 0 |
| 19.05.2023 01:00 - 02:00 | 0 | 0 | 0 | 0 |
| 19.05.2023 02:00 - 03:00 | 0 | 0 | 0 | 0 |
| 19.05.2023 03:00 - 04:00 | 0 | 0 | 0 | 0 |
| 19.05.2023 04:00 - 05:00 | 0 | 0 | 0 | 0 |
| 19.05.2023 05:00 - 06:00 | 0 | 0 | 0 | 0 |
| 19.05.2023 06:00 - 07:00 | 0 | 0 | 0 | 0 |
| 19.05.2023 07:00 - 08:00 | 0 | 0 | 0 | 0 |
| 19.05.2023 08:00 - 09:00 | 0 | 0 | 0 | 0 |
| 19.05.2023 09:00 - 10:00 | 0 | 0 | 0 | 0 |
| 19.05.2023 10:00 - 11:00 | 0 | 0 | 0 | 0 |
| 19.05.2023 11:00 - 12:00 | 0 | 0 | 0 | 0 |
| 19.05.2023 12:00 - 13:00 | 0 | 0 | 0 | 0 |
| 19.05.2023 13:00 - 14:00 | 0 | 0 | 0 | 0 |
| 19.05.2023 14:00 - 15:00 | 0 | 0 | 0 | 0 |
| 19.05.2023 15:00 - 16:00 | 0 | 0 | 0 | 0 |
| 19.05.2023 16:00 - 17:00 | 0 | 0 | 0 | 0 |
| 19.05.2023 17:00 - 18:00 | 0 | 0 | 0 | 0 |
| 19.05.2023 18:00 - 19:00 | 0 | 0 | 0 | 0 |
| 19.05.2023 19:00 - 20:00 | 0 | 0 | 0 | 0 |
| 19.05.2023 20:00 - 21:00 | 0 | 0 | 0 | 0 |
| 19.05.2023 21:00 - 22:00 | 0 | 0 | 0 | 0 |
| 19.05.2023 22:00 - 23:00 | 0 | 0 | 0 | 0 |
| 19.05.2023 23:00 - 24:00 | 0 | 0 | 0 | 0 |
| 20.05.2023 00:00 - 01:00 | 0 | 0 | 0 | 0 |
| 20.05.2023 01:00 - 02:00 | 0 | 0 | 0 | 0 |
| 20.05.2023 02:00 - 03:00 | 0 | 0 | 0 | 0 |
| 20.05.2023 03:00 - 04:00 | 0 | 0 | 0 | 0 |
| 20.05.2023 04:00 - 05:00 | 0 | 0 | 0 | 0 |
| 20.05.2023 05:00 - 06:00 | 0 | 0 | 0 | 0 |
| 20.05.2023 06:00 - 07:00 | 0 | 0 | 0 | 0 |
| 20.05.2023 07:00 - 08:00 | 0 | 0 | 0 | 0 |
| 20.05.2023 08:00 - 09:00 | 0 | 0 | 0 | 0 |
| 20.05.2023 09:00 - 10:00 | 0 | 0 | 0 | 0 |
| 20.05.2023 10:00 - 11:00 | 0 | 0 | 0 | 0 |
| 20.05.2023 11:00 - 12:00 | 0 | 0 | 0 | 0 |
| 20.05.2023 12:00 - 13:00 | 0 | 0 | 0 | 0 |
| 20.05.2023 13:00 - 14:00 | 0 | 0 | 0 | 0 |
| 20.05.2023 14:00 - 15:00 | 0 | 0 | 0 | 0 |
| 20.05.2023 15:00 - 16:00 | 0 | 0 | 0 | 0 |
| 20.05.2023 16:00 - 17:00 | 0 | 0 | 0 | 0 |
| 20.05.2023 17:00 - 18:00 | 0 | 0 | 0 | 0 |
| 20.05.2023 18:00 - 19:00 | 0 | 0 | 0 | 0 |
| 20.05.2023 19:00 - 20:00 | 0 | 0 | 0 | 0 |
| 20.05.2023 20:00 - 21:00 | 0 | 0 | 0 | 0 |
| 20.05.2023 21:00 - 22:00 | 0 | 0 | 0 | 0 |
| 20.05.2023 22:00 - 23:00 | 0 | 0 | 0 | 0 |
| 20.05.2023 23:00 - 24:00 | 0 | 0 | 0 | 0 |
| 21.05.2023 00:00 - 01:00 | 0 | 0 | 0 | 0 |
| 21.05.2023 01:00 - 02:00 | 0 | 0 | 0 | 0 |
| 21.05.2023 02:00 - 03:00 | 0 | 0 | 0 | 0 |
| 21.05.2023 03:00 - 04:00 | 0 | 0 | 0 | 0 |
| 21.05.2023 04:00 - 05:00 | 0 | 0 | 0 | 0 |
| 21.05.2023 05:00 - 06:00 | 0 | 0 | 0 | 0 |
| 21.05.2023 06:00 - 07:00 | 0 | 0 | 0 | 0 |
| 21.05.2023 07:00 - 08:00 | 0 | 0 | 0 | 0 |
| 21.05.2023 08:00 - 09:00 | 0 | 0 | 0 | 0 |
| 21.05.2023 09:00 - 10:00 | 0 | 0 | 0 | 0 |
| 21.05.2023 10:00 - 11:00 | 0 | 0 | 0 | 0 |
| 21.05.2023 11:00 - 12:00 | 0 | 0 | 0 | 0 |
| 21.05.2023 12:00 - 13:00 | 0 | 0 | 0 | 0 |
| 21.05.2023 13:00 - 14:00 | 0 | 0 | 0 | 0 |
| 21.05.2023 14:00 - 15:00 | 0 | 0 | 0 | 0 |
| 21.05.2023 15:00 - 16:00 | 0 | 0 | 0 | 0 |
| 21.05.2023 16:00 - 17:00 | 0 | 0 | 0 | 0 |
| 21.05.2023 17:00 - 18:00 | 0 | 0 | 0 | 0 |
| 21.05.2023 18:00 - 19:00 | 0 | 0 | 0 | 0 |
| 21.05.2023 19:00 - 20:00 | 0 | 0 | 0 | 0 |
| 21.05.2023 20:00 - 21:00 | 0 | 0 | 0 | 0 |
| 21.05.2023 21:00 - 22:00 | 0 | 0 | 0 | 0 |
| 21.05.2023 22:00 - 23:00 | 0 | 0 | 0 | 0 |
| 21.05.2023 23:00 - 24:00 | 0 | 0 | 0 | 0 |
| 22.05.2023 00:00 - 01:00 | 0 | 0 | 0 | 0 |
| 22.05.2023 01:00 - 02:00 | 0 | 0 | 0 | 0 |
| 22.05.2023 02:00 - 03:00 | 0 | 0 | 0 | 0 |
| 22.05.2023 03:00 - 04:00 | 0 | 0 | 0 | 0 |
| 22.05.2023 04:00 - 05:00 | 0 | 0 | 0 | 0 |
| 22.05.2023 05:00 - 06:00 | 0 | 0 | 0 | 0 |
| 22.05.2023 06:00 - 07:00 | 0 | 0 | 0 | 0 |
| 22.05.2023 07:00 - 08:00 | 0 | 0 | 0 | 0 |
| 22.05.2023 08:00 - 09:00 | 0 | 0 | 0 | 0 |
| 22.05.2023 09:00 - 10:00 | 0 | 0 | 0 | 0 |
| 22.05.2023 10:00 - 11:00 | 0 | 0 | 0 | 0 |
| 22.05.2023 11:00 - 12:00 | 0 | 0 | 0 | 0 |
| 22.05.2023 12:00 - 13:00 | 0 | 0 | 0 | 0 |
| 22.05.2023 13:00 - 14:00 | 0 | 0 | 0 | 0 |
| 22.05.2023 14:00 - 15:00 | 0 | 0 | 0 | 0 |
| 22.05.2023 15:00 - 16:00 | 0 | 0 | 0 | 0 |
| 22.05.2023 16:00 - 17:00 | 0 | 0 | 0 | 0 |
| 22.05.2023 17:00 - 18:00 | 0 | 0 | 0 | 0 |
| 22.05.2023 18:00 - 19:00 | 0 | 0 | 0 | 0 |
| 22.05.2023 19:00 - 20:00 | 0 | 0 | 0 | 0 |
| 22.05.2023 20:00 - 21:00 | 0 | 0 | 0 | 0 |
| 22.05.2023 21:00 - 22:00 | 0 | 0 | 0 | 0 |
| 22.05.2023 22:00 - 23:00 | 0 | 0 | 0 | 0 |
| 22.05.2023 23:00 - 24:00 | 0 | 0 | 0 | 0 |
| 23.05.2023 00:00 - 01:00 | 0 | 0 | 0 | 0 |
| 23.05.2023 01:00 - 02:00 | 0 | 0 | 0 | 0 |
| 23.05.2023 02:00 - 03:00 | 0 | 0 | 0 | 0 |
| 23.05.2023 03:00 - 04:00 | 0 | 0 | 0 | 0 |
| 23.05.2023 04:00 - 05:00 | 0 | 0 | 0 | 0 |
| 23.05.2023 05:00 - 06:00 | 0 | 0 | 0 | 0 |
| 23.05.2023 06:00 - 07:00 | 0 | 0 | 0 | 0 |
| 23.05.2023 07:00 - 08:00 | 0 | 0 | 0 | 0 |
| 23.05.2023 08:00 - 09:00 | 0 | 0 | 0 | 0 |
| 23.05.2023 09:00 - 10:00 | 0 | 0 | 0 | 0 |
| 23.05.2023 10:00 - 11:00 | 0 | 0 | 0 | 0 |
| 23.05.2023 11:00 - 12:00 | 0 | 0 | 0 | 0 |
| 23.05.2023 12:00 - 13:00 | 0 | 0 | 0 | 0 |
| 23.05.2023 13:00 - 14:00 | 0 | 0 | 0 | 0 |
| 23.05.2023 14:00 - 15:00 | 0 | 0 | 0 | 0 |
| 23.05.2023 15:00 - 16:00 | 0 | 0 | 0 | 0 |
| 23.05.2023 16:00 - 17:00 | 0 | 0 | 0 | 0 |
| 23.05.2023 17:00 - 18:00 | 0 | 0 | 0 | 0 |
| 23.05.2023 18:00 - 19:00 | 0 | 0 | 0 | 0 |
| 23.05.2023 19:00 - 20:00 | 0 | 0 | 0 | 0 |
| 23.05.2023 20:00 - 21:00 | 0 | 0 | 0 | 0 |
| 23.05.2023 21:00 - 22:00 | 0 | 0 | 0 | 0 |
| 23.05.2023 22:00 - 23:00 | 0 | 0 | 0 | 0 |
| 23.05.2023 23:00 - 24:00 | 0 | 0 | 0 | 0 |
| 24.05.2023 00:00 - 01:00 | 0 | 0 | 0 | 0 |
| 24.05.2023 01:00 - 02:00 | 0 | 0 | 0 | 0 |
| 24.05.2023 02:00 - 03:00 | 0 | 0 | 0 | 0 |
| 24.05.2023 03:00 - 04:00 | 0 | 0 | 0 | 0 |
| 24.05.2023 04:00 - 05:00 | 0 | 0 | 0 | 0 |
| 24.05.2023 05:00 - 06:00 | 0 | 0 | 0 | 0 |
| 24.05.2023 06:00 - 07:00 | 0 | 0 | 0 | 0 |
| 24.05.2023 07:00 - 08:00 | 0 | 0 | 0 | 0 |
| 24.05.2023 08:00 - 09:00 | 0 | 0 | 0 | 0 |
| 24.05.2023 09:00 - 10:00 | 0 | 0 | 0 | 0 |
| 24.05.2023 10:00 - 11:00 | 0 | 0 | 0 | 0 |
| 24.05.2023 11:00 - 12:00 | 0 | 0 | 0 | 0 |
| 24.05.2023 12:00 - 13:00 | 0 | 0 | 0 | 0 |
| 24.05.2023 13:00 - 14:00 | 0 | 0 | 0 | 0 |
| 24.05.2023 14:00 - 15:00 | 0 | 0 | 0 | 0 |
| 24.05.2023 15:00 - 16:00 | 0 | 0 | 0 | 0 |
| 24.05.2023 16:00 - 17:00 | 0 | 0 | 0 | 0 |
| 24.05.2023 17:00 - 18:00 | 0 | 0 | 0 | 0 |
| 24.05.2023 18:00 - 19:00 | 0 | 0 | 0 | 0 |
| 24.05.2023 19:00 - 20:00 | 0 | 0 | 0 | 0 |
| 24.05.2023 20:00 - 21:00 | 0 | 0 | 0 | 0 |
| 24.05.2023 21:00 - 22:00 | 0 | 0 | 0 | 0 |
| 24.05.2023 22:00 - 23:00 | 0 | 0 | 0 | 0 |
| 24.05.2023 23:00 - 24:00 | 0 | 0 | 0 | 0 |
| 25.05.2023 00:00 - 01:00 | 0 | 0 | 0 | 0 |
| 25.05.2023 01:00 - 02:00 | 0 | 0 | 0 | 0 |
| 25.05.2023 02:00 - 03:00 | 0 | 0 | 0 | 0 |
| 25.05.2023 03:00 - 04:00 | 0 | 0 | 0 | 0 |
| 25.05.2023 04:00 - 05:00 | 0 | 0 | 0 | 0 |
| 25.05.2023 05:00 - 06:00 | 0 | 0 | 0 | 0 |
| 25.05.2023 06:00 - 07:00 | 0 | 0 | 0 | 0 |
| 25.05.2023 07:00 - 08:00 | 0 | 0 | 0 | 0 |
| 25.05.2023 08:00 - 09:00 | 0 | 0 | 0 | 0 |
| 25.05.2023 09:00 - 10:00 | 0 | 0 | 0 | 0 |
| 25.05.2023 10:00 - 11:00 | 0 | 0 | 0 | 0 |
| 25.05.2023 11:00 - 12:00 | 0 | 0 | 0 | 0 |
| 25.05.2023 12:00 - 13:00 | 0 | 0 | 0 | 0 |
| 25.05.2023 13:00 - 14:00 | 50 | 0 | 0 | 0 |
| 25.05.2023 14:00 - 15:00 | 50 | 0 | 0 | 0 |
| 25.05.2023 15:00 - 16:00 | 50 | 0 | 0 | 0 |
| 25.05.2023 16:00 - 17:00 | 50 | 0 | 0 | 0 |
| 25.05.2023 17:00 - 18:00 | 50 | 0 | 0 | 0 |
| 25.05.2023 18:00 - 19:00 | 50 | 0 | 0 | 0 |
| 25.05.2023 19:00 - 20:00 | 50 | 0 | 0 | 0 |
| 25.05.2023 20:00 - 21:00 | 50 | 0 | 0 | 0 |
| 25.05.2023 21:00 - 22:00 | 50 | 0 | 0 | 0 |
| 25.05.2023 22:00 - 23:00 | 50 | 0 | 0 | 0 |
| 25.05.2023 23:00 - 24:00 | 50 | 0 | 0 | 0 |
| 26.05.2023 00:00 - 01:00 | 50 | 0 | 0 | 0 |
| 26.05.2023 01:00 - 02:00 | 50 | 0 | 0 | 0 |
| 26.05.2023 02:00 - 03:00 | 50 | 0 | 0 | 0 |
| 26.05.2023 03:00 - 04:00 | 50 | 0 | 0 | 0 |
| 26.05.2023 04:00 - 05:00 | 50 | 0 | 0 | 0 |
| 26.05.2023 05:00 - 06:00 | 50 | 0 | 0 | 0 |
| 26.05.2023 06:00 - 07:00 | 0 | 0 | 0 | 0 |
| 26.05.2023 07:00 - 08:00 | 0 | 0 | 0 | 0 |
| 26.05.2023 08:00 - 09:00 | 0 | 0 | 0 | 0 |
| 26.05.2023 09:00 - 10:00 | 0 | 0 | 0 | 0 |
| 26.05.2023 10:00 - 11:00 | 0 | 0 | 0 | 0 |
| 26.05.2023 11:00 - 12:00 | 0 | 0 | 0 | 0 |
| 26.05.2023 12:00 - 13:00 | 0 | 0 | 0 | 0 |
| 26.05.2023 13:00 - 14:00 | 0 | 0 | 0 | 0 |
| 26.05.2023 14:00 - 15:00 | 0 | 0 | 0 | 0 |
| 26.05.2023 15:00 - 16:00 | 0 | 0 | 0 | 0 |
| 26.05.2023 16:00 - 17:00 | 0 | 0 | 0 | 0 |
| 26.05.2023 17:00 - 18:00 | 0 | 0 | 0 | 0 |
| 26.05.2023 18:00 - 19:00 | 0 | 0 | 0 | 0 |
| 26.05.2023 19:00 - 20:00 | 0 | 0 | 0 | 0 |
| 26.05.2023 20:00 - 21:00 | 0 | 0 | 0 | 0 |
| 26.05.2023 21:00 - 22:00 | 0 | 0 | 0 | 0 |
| 26.05.2023 22:00 - 23:00 | 0 | 0 | 0 | 0 |
| 26.05.2023 23:00 - 24:00 | 0 | 0 | 0 | 0 |
| 27.05.2023 00:00 - 01:00 | 0 | 0 | 0 | 0 |
| 27.05.2023 01:00 - 02:00 | 0 | 0 | 0 | 0 |
| 27.05.2023 02:00 - 03:00 | 0 | 0 | 0 | 0 |
| 27.05.2023 03:00 - 04:00 | 0 | 0 | 0 | 0 |
| 27.05.2023 04:00 - 05:00 | 0 | 0 | 0 | 0 |
| 27.05.2023 05:00 - 06:00 | 0 | 0 | 0 | 0 |
| 27.05.2023 06:00 - 07:00 | 0 | 0 | 0 | 0 |
| 27.05.2023 07:00 - 08:00 | 0 | 0 | 0 | 0 |
| 27.05.2023 08:00 - 09:00 | 0 | 0 | 0 | 0 |
| 27.05.2023 09:00 - 10:00 | 0 | 0 | 0 | 0 |
| 27.05.2023 10:00 - 11:00 | 0 | 0 | 0 | 0 |
| 27.05.2023 11:00 - 12:00 | 0 | 0 | 0 | 0 |
| 27.05.2023 12:00 - 13:00 | 0 | 0 | 0 | 0 |
| 27.05.2023 13:00 - 14:00 | 0 | 0 | 0 | 0 |
| 27.05.2023 14:00 - 15:00 | 0 | 0 | 0 | 0 |
| 27.05.2023 15:00 - 16:00 | 0 | -30 | 0 | 0 |
| 27.05.2023 16:00 - 17:00 | 0 | -60 | 0 | 0 |
| 27.05.2023 17:00 - 18:00 | 0 | -60 | 0 | 0 |
| 27.05.2023 18:00 - 19:00 | 0 | -90 | 0 | 0 |
| 27.05.2023 19:00 - 20:00 | 0 | -90 | 0 | 0 |
| 27.05.2023 20:00 - 21:00 | 0 | -90 | 0 | 0 |
| 27.05.2023 21:00 - 22:00 | 0 | -90 | 0 | 0 |
| 27.05.2023 22:00 - 23:00 | 0 | -90 | 0 | 0 |
| 27.05.2023 23:00 - 24:00 | 0 | -90 | 0 | 0 |
| 28.05.2023 00:00 - 01:00 | 0 | -90 | 0 | 0 |
| 28.05.2023 01:00 - 02:00 | 0 | -90 | 0 | 0 |
| 28.05.2023 02:00 - 03:00 | 0 | -90 | 0 | 0 |
| 28.05.2023 03:00 - 04:00 | 0 | -90 | 0 | 0 |
| 28.05.2023 04:00 - 05:00 | 0 | -90 | 0 | 0 |
| 28.05.2023 05:00 - 06:00 | 0 | -90 | 0 | 0 |
| 28.05.2023 06:00 - 07:00 | 0 | 0 | 0 | 0 |
| 28.05.2023 07:00 - 08:00 | 0 | 0 | 0 | 0 |
| 28.05.2023 08:00 - 09:00 | 0 | 0 | 0 | 0 |
| 28.05.2023 09:00 - 10:00 | 0 | 0 | 0 | 0 |
| 28.05.2023 10:00 - 11:00 | 0 | 0 | 0 | 0 |
| 28.05.2023 11:00 - 12:00 | 0 | 0 | 0 | 0 |
| 28.05.2023 12:00 - 13:00 | 0 | 0 | 0 | 0 |
| 28.05.2023 13:00 - 14:00 | 0 | 0 | 0 | 0 |
| 28.05.2023 14:00 - 15:00 | 0 | 0 | 0 | 0 |
| 28.05.2023 15:00 - 16:00 | 0 | 0 | 0 | 0 |
| 28.05.2023 16:00 - 17:00 | 0 | 0 | 0 | 0 |
| 28.05.2023 17:00 - 18:00 | 0 | 0 | 0 | 0 |
| 28.05.2023 18:00 - 19:00 | 0 | 0 | 0 | 0 |
| 28.05.2023 19:00 - 20:00 | 0 | 0 | 0 | 0 |
| 28.05.2023 20:00 - 21:00 | 0 | 0 | 0 | 0 |
| 28.05.2023 21:00 - 22:00 | 0 | 0 | 0 | 0 |
| 28.05.2023 22:00 - 23:00 | 0 | 0 | 0 | 0 |
| 28.05.2023 23:00 - 24:00 | 0 | 0 | 0 | 0 |
| 29.05.2023 00:00 - 01:00 | 0 | 0 | 0 | 0 |
| 29.05.2023 01:00 - 02:00 | 0 | 0 | 0 | 0 |
| 29.05.2023 02:00 - 03:00 | 0 | -60 | 0 | 0 |
| 29.05.2023 03:00 - 04:00 | 0 | -60 | 0 | 0 |
| 29.05.2023 04:00 - 05:00 | 0 | -60 | 0 | 0 |
| 29.05.2023 05:00 - 06:00 | 0 | -60 | 0 | 0 |
| 29.05.2023 06:00 - 07:00 | 0 | 0 | 0 | 0 |
| 29.05.2023 07:00 - 08:00 | 0 | 0 | 0 | 0 |
| 29.05.2023 08:00 - 09:00 | 0 | 0 | 0 | 0 |
| 29.05.2023 09:00 - 10:00 | 0 | 0 | 0 | 0 |
| 29.05.2023 10:00 - 11:00 | 0 | 0 | 0 | 0 |
| 29.05.2023 11:00 - 12:00 | 0 | 0 | 0 | 0 |
| 29.05.2023 12:00 - 13:00 | 0 | 0 | 0 | 0 |
| 29.05.2023 13:00 - 14:00 | 0 | -20 | 0 | 0 |
| 29.05.2023 14:00 - 15:00 | 0 | -20 | 0 | 0 |
| 29.05.2023 15:00 - 16:00 | 0 | -20 | 0 | 0 |
| 29.05.2023 16:00 - 17:00 | 0 | -20 | 0 | 0 |
| 29.05.2023 17:00 - 18:00 | 0 | -20 | 0 | 0 |
| 29.05.2023 18:00 - 19:00 | 0 | -20 | 0 | 0 |
| 29.05.2023 19:00 - 20:00 | 0 | -20 | 0 | 0 |
| 29.05.2023 20:00 - 21:00 | 0 | -20 | 0 | 0 |
| 29.05.2023 21:00 - 22:00 | 0 | -20 | 0 | 0 |
| 29.05.2023 22:00 - 23:00 | 0 | -20 | 0 | 0 |
| 29.05.2023 23:00 - 24:00 | 0 | -20 | 0 | 0 |
| 30.05.2023 00:00 - 01:00 | 0 | -20 | 0 | 0 |
| 30.05.2023 01:00 - 02:00 | 0 | -20 | 0 | 0 |
| 30.05.2023 02:00 - 03:00 | 0 | -20 | 0 | 0 |
| 30.05.2023 03:00 - 04:00 | 0 | -20 | 0 | 0 |
| 30.05.2023 04:00 - 05:00 | 0 | -20 | 0 | 0 |
| 30.05.2023 05:00 - 06:00 | 0 | -20 | 0 | 0 |
| 30.05.2023 06:00 - 07:00 | 0 | 0 | 0 | 0 |
| 30.05.2023 07:00 - 08:00 | 0 | 0 | 0 | 0 |
| 30.05.2023 08:00 - 09:00 | 0 | 0 | 0 | 0 |
| 30.05.2023 09:00 - 10:00 | 0 | 0 | 0 | 0 |
| 30.05.2023 10:00 - 11:00 | 0 | 0 | 0 | 0 |
| 30.05.2023 11:00 - 12:00 | 0 | 0 | 0 | 0 |
| 30.05.2023 12:00 - 13:00 | 0 | 0 | 0 | 0 |
| 30.05.2023 13:00 - 14:00 | 0 | 0 | 0 | 0 |
| 30.05.2023 14:00 - 15:00 | 0 | 0 | 0 | 0 |
| 30.05.2023 15:00 - 16:00 | 0 | 0 | 0 | 0 |
| 30.05.2023 16:00 - 17:00 | 0 | 0 | 0 | 0 |
| 30.05.2023 17:00 - 18:00 | 0 | 0 | 0 | 0 |
| 30.05.2023 18:00 - 19:00 | 0 | 0 | 0 | 0 |
| 30.05.2023 19:00 - 20:00 | 0 | 0 | 0 | 0 |
| 30.05.2023 20:00 - 21:00 | 0 | 0 | 0 | 0 |
| 30.05.2023 21:00 - 22:00 | 0 | 0 | 0 | 0 |
| 30.05.2023 22:00 - 23:00 | 0 | 0 | 0 | 0 |
| 30.05.2023 23:00 - 24:00 | 0 | 0 | 0 | 0 |
| 31.05.2023 00:00 - 01:00 | 0 | 0 | 0 | 0 |
| 31.05.2023 01:00 - 02:00 | 0 | 0 | 0 | 0 |
| 31.05.2023 02:00 - 03:00 | 0 | 0 | 0 | 0 |
| 31.05.2023 03:00 - 04:00 | 0 | 0 | 0 | 0 |
| 31.05.2023 04:00 - 05:00 | 0 | 0 | 0 | 0 |
| 31.05.2023 05:00 - 06:00 | 0 | 0 | 0 | 0 |
| 31.05.2023 06:00 - 07:00 | 0 | 0 | 0 | 0 |
| 31.05.2023 07:00 - 08:00 | 0 | 0 | 0 | 0 |
| 31.05.2023 08:00 - 09:00 | 0 | 0 | 0 | 0 |
| 31.05.2023 09:00 - 10:00 | 0 | 0 | 0 | 0 |
| 31.05.2023 10:00 - 11:00 | 0 | 0 | 0 | 0 |
| 31.05.2023 11:00 - 12:00 | 0 | 0 | 0 | 0 |
| 31.05.2023 12:00 - 13:00 | 0 | 0 | 0 | 0 |
| 31.05.2023 13:00 - 14:00 | 0 | 0 | 0 | 0 |
| 31.05.2023 14:00 - 15:00 | 0 | 0 | 0 | 0 |
| 31.05.2023 15:00 - 16:00 | 0 | 0 | 0 | 0 |
| 31.05.2023 16:00 - 17:00 | 0 | 0 | 0 | 0 |
| 31.05.2023 17:00 - 18:00 | 0 | 0 | 0 | 0 |
| 31.05.2023 18:00 - 19:00 | 0 | 0 | 0 | 0 |
| 31.05.2023 19:00 - 20:00 | 0 | 0 | 0 | 0 |
| 31.05.2023 20:00 - 21:00 | 0 | 0 | 0 | 0 |
| 31.05.2023 21:00 - 22:00 | 0 | 0 | 0 | 0 |
| 31.05.2023 22:00 - 23:00 | 0 | 0 | 0 | 0 |
| 31.05.2023 23:00 - 24:00 | 0 | 0 | 0 | 0 |
| 01.06.2023 00:00 - 01:00 | 0 | 0 | 0 | 0 |
| 01.06.2023 01:00 - 02:00 | 0 | 0 | 0 | 0 |
| 01.06.2023 02:00 - 03:00 | 0 | 0 | 0 | 0 |
| 01.06.2023 03:00 - 04:00 | 0 | 0 | 0 | 0 |
| 01.06.2023 04:00 - 05:00 | 0 | 0 | 0 | 0 |
| 01.06.2023 05:00 - 06:00 | 0 | 0 | 0 | 0 |